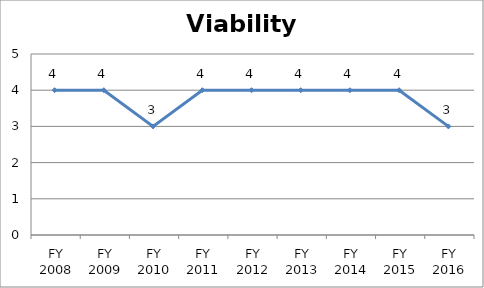
| Category | Viability score |
|---|---|
| FY 2016 | 3 |
| FY 2015 | 4 |
| FY 2014 | 4 |
| FY 2013 | 4 |
| FY 2012 | 4 |
| FY 2011 | 4 |
| FY 2010 | 3 |
| FY 2009 | 4 |
| FY 2008 | 4 |